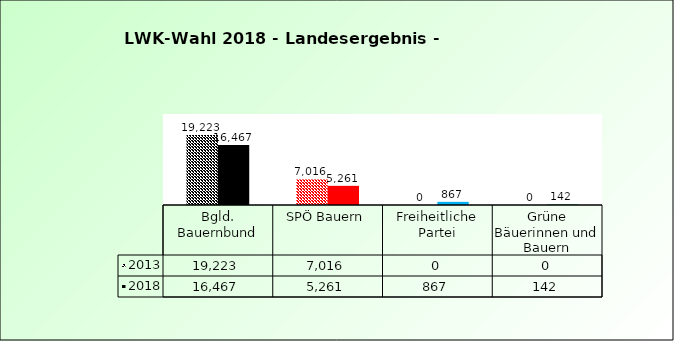
| Category | 2013 | 2018 |
|---|---|---|
| Bgld. Bauernbund | 19223 | 16467 |
| SPÖ Bauern | 7016 | 5261 |
| Freiheitliche Partei | 0 | 867 |
| Grüne Bäuerinnen und Bauern | 0 | 142 |